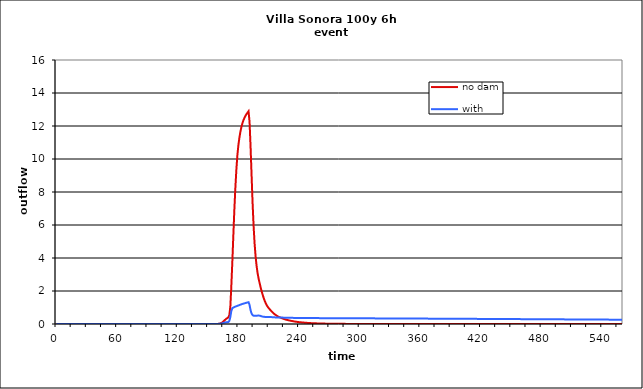
| Category | no dam | with dam |
|---|---|---|
| 0.0 | 0 | 0 |
| 1.0 | 0 | 0 |
| 2.0 | 0 | 0 |
| 3.0 | 0 | 0 |
| 4.0 | 0 | 0 |
| 5.0 | 0 | 0 |
| 6.0 | 0 | 0 |
| 7.0 | 0 | 0 |
| 8.0 | 0 | 0 |
| 9.0 | 0 | 0 |
| 10.0 | 0 | 0 |
| 11.0 | 0 | 0 |
| 12.0 | 0 | 0 |
| 13.0 | 0 | 0 |
| 14.0 | 0 | 0 |
| 15.0 | 0 | 0 |
| 16.0 | 0 | 0 |
| 17.0 | 0 | 0 |
| 18.0 | 0 | 0 |
| 19.0 | 0 | 0 |
| 20.0 | 0 | 0 |
| 21.0 | 0 | 0 |
| 22.0 | 0 | 0 |
| 23.0 | 0 | 0 |
| 24.0 | 0 | 0 |
| 25.0 | 0 | 0 |
| 26.0 | 0 | 0 |
| 27.0 | 0 | 0 |
| 28.0 | 0 | 0 |
| 29.0 | 0 | 0 |
| 30.0 | 0 | 0 |
| 31.0 | 0 | 0 |
| 32.0 | 0 | 0 |
| 33.0 | 0 | 0 |
| 34.0 | 0 | 0 |
| 35.0 | 0 | 0 |
| 36.0 | 0 | 0 |
| 37.0 | 0 | 0 |
| 38.0 | 0 | 0 |
| 39.0 | 0 | 0 |
| 40.0 | 0 | 0 |
| 41.0 | 0 | 0 |
| 42.0 | 0 | 0 |
| 43.0 | 0 | 0 |
| 44.0 | 0 | 0 |
| 45.0 | 0 | 0 |
| 46.0 | 0 | 0 |
| 47.0 | 0 | 0 |
| 48.0 | 0 | 0 |
| 49.0 | 0 | 0 |
| 50.0 | 0 | 0 |
| 51.0 | 0 | 0 |
| 52.0 | 0 | 0 |
| 53.0 | 0 | 0 |
| 54.0 | 0 | 0 |
| 55.0 | 0 | 0 |
| 56.0 | 0 | 0 |
| 57.0 | 0 | 0 |
| 58.0 | 0 | 0 |
| 59.0 | 0 | 0 |
| 60.0 | 0 | 0 |
| 61.0 | 0 | 0 |
| 62.0 | 0 | 0 |
| 63.0 | 0 | 0 |
| 64.0 | 0 | 0 |
| 65.0 | 0 | 0 |
| 66.0 | 0 | 0 |
| 67.0 | 0 | 0 |
| 68.0 | 0 | 0 |
| 69.0 | 0 | 0 |
| 70.0 | 0 | 0 |
| 71.0 | 0 | 0 |
| 72.0 | 0 | 0 |
| 73.0 | 0 | 0 |
| 74.0 | 0 | 0 |
| 75.0 | 0 | 0 |
| 76.0 | 0 | 0 |
| 77.0 | 0 | 0 |
| 78.0 | 0 | 0 |
| 79.0 | 0 | 0 |
| 80.0 | 0 | 0 |
| 81.0 | 0 | 0 |
| 82.0 | 0 | 0 |
| 83.0 | 0 | 0 |
| 84.0 | 0 | 0 |
| 85.0 | 0 | 0 |
| 86.0 | 0 | 0 |
| 87.0 | 0 | 0 |
| 88.0 | 0 | 0 |
| 89.0 | 0 | 0 |
| 90.0 | 0 | 0 |
| 91.0 | 0 | 0 |
| 92.0 | 0 | 0 |
| 93.0 | 0 | 0 |
| 94.0 | 0 | 0 |
| 95.0 | 0 | 0 |
| 96.0 | 0 | 0 |
| 97.0 | 0 | 0 |
| 98.0 | 0 | 0 |
| 99.0 | 0 | 0 |
| 100.0 | 0 | 0 |
| 101.0 | 0 | 0 |
| 102.0 | 0 | 0 |
| 103.0 | 0 | 0 |
| 104.0 | 0 | 0 |
| 105.0 | 0 | 0 |
| 106.0 | 0 | 0 |
| 107.0 | 0 | 0 |
| 108.0 | 0 | 0 |
| 109.0 | 0 | 0 |
| 110.0 | 0 | 0 |
| 111.0 | 0 | 0 |
| 112.0 | 0 | 0 |
| 113.0 | 0 | 0 |
| 114.0 | 0 | 0 |
| 115.0 | 0 | 0 |
| 116.0 | 0 | 0 |
| 117.0 | 0 | 0 |
| 118.0 | 0 | 0 |
| 119.0 | 0 | 0 |
| 120.0 | 0 | 0 |
| 121.0 | 0 | 0 |
| 122.0 | 0 | 0 |
| 123.0 | 0 | 0 |
| 124.0 | 0 | 0 |
| 125.0 | 0 | 0 |
| 126.0 | 0 | 0 |
| 127.0 | 0 | 0 |
| 128.0 | 0 | 0 |
| 129.0 | 0 | 0 |
| 130.0 | 0 | 0 |
| 131.0 | 0 | 0 |
| 132.0 | 0 | 0 |
| 133.0 | 0 | 0 |
| 134.0 | 0 | 0 |
| 135.0 | 0 | 0 |
| 136.0 | 0 | 0 |
| 137.0 | 0 | 0 |
| 138.0 | 0 | 0 |
| 139.0 | 0 | 0 |
| 140.0 | 0 | 0 |
| 141.0 | 0 | 0 |
| 142.0 | 0 | 0 |
| 143.0 | 0 | 0 |
| 144.0 | 0 | 0 |
| 145.0 | 0 | 0 |
| 146.0 | 0 | 0 |
| 147.0 | 0 | 0 |
| 148.0 | 0 | 0 |
| 149.0 | 0 | 0 |
| 150.0 | 0 | 0 |
| 151.0 | 0 | 0 |
| 152.0 | 0 | 0 |
| 153.0 | 0 | 0 |
| 154.0 | 0 | 0 |
| 155.0 | 0.001 | 0.001 |
| 156.0 | 0.001 | 0.001 |
| 157.0 | 0.002 | 0.002 |
| 158.0 | 0.003 | 0.003 |
| 159.0 | 0.004 | 0.005 |
| 160.0 | 0.008 | 0.007 |
| 161.0 | 0.01 | 0.01 |
| 162.0 | 0.037 | 0.017 |
| 163.0 | 0.063 | 0.027 |
| 164.0 | 0.095 | 0.042 |
| 165.0 | 0.143 | 0.06 |
| 166.0 | 0.206 | 0.079 |
| 167.0 | 0.265 | 0.094 |
| 168.0 | 0.317 | 0.105 |
| 169.0 | 0.36 | 0.112 |
| 170.0 | 0.398 | 0.117 |
| 171.0 | 0.539 | 0.186 |
| 172.0 | 1.054 | 0.429 |
| 173.0 | 2.341 | 0.794 |
| 174.0 | 3.813 | 0.962 |
| 175.0 | 5.418 | 0.999 |
| 176.0 | 6.974 | 1.025 |
| 177.0 | 8.288 | 1.054 |
| 178.0 | 9.398 | 1.078 |
| 179.0 | 10.257 | 1.101 |
| 180.0 | 10.858 | 1.125 |
| 181.0 | 11.307 | 1.148 |
| 182.0 | 11.668 | 1.172 |
| 183.0 | 11.954 | 1.194 |
| 184.0 | 12.178 | 1.215 |
| 185.0 | 12.358 | 1.235 |
| 186.0 | 12.499 | 1.254 |
| 187.0 | 12.62 | 1.272 |
| 188.0 | 12.723 | 1.289 |
| 189.0 | 12.81 | 1.305 |
| 190.0 | 12.893 | 1.32 |
| 191.0 | 12.262 | 1.159 |
| 192.0 | 10.764 | 0.843 |
| 193.0 | 9.039 | 0.634 |
| 194.0 | 7.346 | 0.539 |
| 195.0 | 5.944 | 0.504 |
| 196.0 | 4.874 | 0.498 |
| 197.0 | 4.085 | 0.501 |
| 198.0 | 3.505 | 0.505 |
| 199.0 | 3.068 | 0.508 |
| 200.0 | 2.741 | 0.511 |
| 201.0 | 2.471 | 0.505 |
| 202.0 | 2.213 | 0.486 |
| 203.0 | 1.977 | 0.463 |
| 204.0 | 1.766 | 0.448 |
| 205.0 | 1.575 | 0.437 |
| 206.0 | 1.406 | 0.431 |
| 207.0 | 1.26 | 0.429 |
| 208.0 | 1.139 | 0.429 |
| 209.0 | 1.04 | 0.43 |
| 210.0 | 0.959 | 0.431 |
| 211.0 | 0.888 | 0.429 |
| 212.0 | 0.82 | 0.424 |
| 213.0 | 0.754 | 0.416 |
| 214.0 | 0.692 | 0.41 |
| 215.0 | 0.635 | 0.405 |
| 216.0 | 0.584 | 0.402 |
| 217.0 | 0.538 | 0.399 |
| 218.0 | 0.498 | 0.398 |
| 219.0 | 0.462 | 0.397 |
| 220.0 | 0.431 | 0.398 |
| 221.0 | 0.403 | 0.397 |
| 222.0 | 0.378 | 0.394 |
| 223.0 | 0.353 | 0.39 |
| 224.0 | 0.328 | 0.387 |
| 225.0 | 0.306 | 0.385 |
| 226.0 | 0.285 | 0.383 |
| 227.0 | 0.266 | 0.381 |
| 228.0 | 0.249 | 0.38 |
| 229.0 | 0.233 | 0.379 |
| 230.0 | 0.219 | 0.378 |
| 231.0 | 0.205 | 0.377 |
| 232.0 | 0.193 | 0.375 |
| 233.0 | 0.181 | 0.373 |
| 234.0 | 0.169 | 0.372 |
| 235.0 | 0.158 | 0.37 |
| 236.0 | 0.147 | 0.369 |
| 237.0 | 0.138 | 0.368 |
| 238.0 | 0.129 | 0.367 |
| 239.0 | 0.121 | 0.366 |
| 240.0 | 0.113 | 0.365 |
| 241.0 | 0.107 | 0.365 |
| 242.0 | 0.1 | 0.364 |
| 243.0 | 0.094 | 0.363 |
| 244.0 | 0.089 | 0.362 |
| 245.0 | 0.083 | 0.362 |
| 246.0 | 0.078 | 0.361 |
| 247.0 | 0.073 | 0.36 |
| 248.0 | 0.068 | 0.36 |
| 249.0 | 0.064 | 0.36 |
| 250.0 | 0.06 | 0.359 |
| 251.0 | 0.056 | 0.359 |
| 252.0 | 0.052 | 0.358 |
| 253.0 | 0.049 | 0.358 |
| 254.0 | 0.046 | 0.357 |
| 255.0 | 0.044 | 0.357 |
| 256.0 | 0.041 | 0.357 |
| 257.0 | 0.039 | 0.357 |
| 258.0 | 0.036 | 0.356 |
| 259.0 | 0.034 | 0.356 |
| 260.0 | 0.032 | 0.356 |
| 261.0 | 0.03 | 0.356 |
| 262.0 | 0.029 | 0.355 |
| 263.0 | 0.027 | 0.355 |
| 264.0 | 0.025 | 0.355 |
| 265.0 | 0.024 | 0.355 |
| 266.0 | 0.023 | 0.354 |
| 267.0 | 0.021 | 0.354 |
| 268.0 | 0.02 | 0.354 |
| 269.0 | 0.019 | 0.354 |
| 270.0 | 0.018 | 0.353 |
| 271.0 | 0.017 | 0.353 |
| 272.0 | 0.016 | 0.353 |
| 273.0 | 0.015 | 0.353 |
| 274.0 | 0.014 | 0.352 |
| 275.0 | 0.014 | 0.352 |
| 276.0 | 0.013 | 0.352 |
| 277.0 | 0.012 | 0.352 |
| 278.0 | 0.011 | 0.351 |
| 279.0 | 0.011 | 0.351 |
| 280.0 | 0.01 | 0.351 |
| 281.0 | 0.01 | 0.35 |
| 282.0 | 0.009 | 0.35 |
| 283.0 | 0.009 | 0.35 |
| 284.0 | 0.008 | 0.35 |
| 285.0 | 0.008 | 0.349 |
| 286.0 | 0.007 | 0.349 |
| 287.0 | 0.007 | 0.349 |
| 288.0 | 0.007 | 0.349 |
| 289.0 | 0.006 | 0.348 |
| 290.0 | 0.006 | 0.348 |
| 291.0 | 0.005 | 0.348 |
| 292.0 | 0.005 | 0.347 |
| 293.0 | 0.005 | 0.347 |
| 294.0 | 0.005 | 0.347 |
| 295.0 | 0.004 | 0.347 |
| 296.0 | 0.004 | 0.346 |
| 297.0 | 0.004 | 0.346 |
| 298.0 | 0.003 | 0.346 |
| 299.0 | 0.003 | 0.345 |
| 300.0 | 0.003 | 0.345 |
| 301.0 | 0.003 | 0.345 |
| 302.0 | 0.003 | 0.345 |
| 303.0 | 0.002 | 0.344 |
| 304.0 | 0.002 | 0.344 |
| 305.0 | 0.002 | 0.344 |
| 306.0 | 0.002 | 0.343 |
| 307.0 | 0.002 | 0.343 |
| 308.0 | 0.002 | 0.343 |
| 309.0 | 0.001 | 0.343 |
| 310.0 | 0.001 | 0.342 |
| 311.0 | 0.001 | 0.342 |
| 312.0 | 0.001 | 0.342 |
| 313.0 | 0.001 | 0.341 |
| 314.0 | 0.001 | 0.341 |
| 315.0 | 0.001 | 0.341 |
| 316.0 | 0.001 | 0.341 |
| 317.0 | 0.001 | 0.34 |
| 318.0 | 0.001 | 0.34 |
| 319.0 | 0.001 | 0.34 |
| 320.0 | 0 | 0.339 |
| 321.0 | 0 | 0.339 |
| 322.0 | 0 | 0.339 |
| 323.0 | 0 | 0.339 |
| 324.0 | 0 | 0.338 |
| 325.0 | 0 | 0.338 |
| 326.0 | 0 | 0.338 |
| 327.0 | 0 | 0.337 |
| 328.0 | 0 | 0.337 |
| 329.0 | 0 | 0.337 |
| 330.0 | 0 | 0.337 |
| 331.0 | 0 | 0.336 |
| 332.0 | 0 | 0.336 |
| 333.0 | 0 | 0.336 |
| 334.0 | 0 | 0.335 |
| 335.0 | 0 | 0.335 |
| 336.0 | 0 | 0.335 |
| 337.0 | 0 | 0.335 |
| 338.0 | 0 | 0.334 |
| 339.0 | 0 | 0.334 |
| 340.0 | 0 | 0.334 |
| 341.0 | 0 | 0.333 |
| 342.0 | 0 | 0.333 |
| 343.0 | 0 | 0.333 |
| 344.0 | 0 | 0.332 |
| 345.0 | 0 | 0.332 |
| 346.0 | 0 | 0.332 |
| 347.0 | 0 | 0.332 |
| 348.0 | 0 | 0.331 |
| 349.0 | 0 | 0.331 |
| 350.0 | 0 | 0.331 |
| 351.0 | 0 | 0.33 |
| 352.0 | 0 | 0.33 |
| 353.0 | 0 | 0.33 |
| 354.0 | 0 | 0.33 |
| 355.0 | 0 | 0.329 |
| 356.0 | 0 | 0.329 |
| 357.0 | 0 | 0.329 |
| 358.0 | 0 | 0.328 |
| 359.0 | 0 | 0.328 |
| 360.0 | 0 | 0.328 |
| 361.0 | 0 | 0.328 |
| 362.0 | 0 | 0.327 |
| 363.0 | 0 | 0.327 |
| 364.0 | 0 | 0.327 |
| 365.0 | 0 | 0.326 |
| 366.0 | 0 | 0.326 |
| 367.0 | 0 | 0.326 |
| 368.0 | 0 | 0.325 |
| 369.0 | 0 | 0.325 |
| 370.0 | 0 | 0.325 |
| 371.0 | 0 | 0.325 |
| 372.0 | 0 | 0.324 |
| 373.0 | 0 | 0.324 |
| 374.0 | 0 | 0.324 |
| 375.0 | 0 | 0.323 |
| 376.0 | 0 | 0.323 |
| 377.0 | 0 | 0.323 |
| 378.0 | 0 | 0.323 |
| 379.0 | 0 | 0.322 |
| 380.0 | 0 | 0.322 |
| 381.0 | 0 | 0.322 |
| 382.0 | 0 | 0.321 |
| 383.0 | 0 | 0.321 |
| 384.0 | 0 | 0.321 |
| 385.0 | 0 | 0.32 |
| 386.0 | 0 | 0.32 |
| 387.0 | 0 | 0.32 |
| 388.0 | 0 | 0.32 |
| 389.0 | 0 | 0.319 |
| 390.0 | 0 | 0.319 |
| 391.0 | 0 | 0.319 |
| 392.0 | 0 | 0.318 |
| 393.0 | 0 | 0.318 |
| 394.0 | 0 | 0.318 |
| 395.0 | 0 | 0.318 |
| 396.0 | 0 | 0.317 |
| 397.0 | 0 | 0.317 |
| 398.0 | 0 | 0.317 |
| 399.0 | 0 | 0.316 |
| 400.0 | 0 | 0.316 |
| 401.0 | 0 | 0.316 |
| 402.0 | 0 | 0.315 |
| 403.0 | 0 | 0.315 |
| 404.0 | 0 | 0.315 |
| 405.0 | 0 | 0.314 |
| 406.0 | 0 | 0.314 |
| 407.0 | 0 | 0.314 |
| 408.0 | 0 | 0.313 |
| 409.0 | 0 | 0.313 |
| 410.0 | 0 | 0.313 |
| 411.0 | 0 | 0.312 |
| 412.0 | 0 | 0.312 |
| 413.0 | 0 | 0.312 |
| 414.0 | 0 | 0.311 |
| 415.0 | 0 | 0.311 |
| 416.0 | 0 | 0.31 |
| 417.0 | 0 | 0.31 |
| 418.0 | 0 | 0.31 |
| 419.0 | 0 | 0.309 |
| 420.0 | 0 | 0.309 |
| 421.0 | 0 | 0.309 |
| 422.0 | 0 | 0.308 |
| 423.0 | 0 | 0.308 |
| 424.0 | 0 | 0.308 |
| 425.0 | 0 | 0.307 |
| 426.0 | 0 | 0.307 |
| 427.0 | 0 | 0.307 |
| 428.0 | 0 | 0.306 |
| 429.0 | 0 | 0.306 |
| 430.0 | 0 | 0.306 |
| 431.0 | 0 | 0.305 |
| 432.0 | 0 | 0.305 |
| 433.0 | 0 | 0.304 |
| 434.0 | 0 | 0.304 |
| 435.0 | 0 | 0.304 |
| 436.0 | 0 | 0.303 |
| 437.0 | 0 | 0.303 |
| 438.0 | 0 | 0.303 |
| 439.0 | 0 | 0.302 |
| 440.0 | 0 | 0.302 |
| 441.0 | 0 | 0.302 |
| 442.0 | 0 | 0.301 |
| 443.0 | 0 | 0.301 |
| 444.0 | 0 | 0.301 |
| 445.0 | 0 | 0.3 |
| 446.0 | 0 | 0.3 |
| 447.0 | 0 | 0.3 |
| 448.0 | 0 | 0.299 |
| 449.0 | 0 | 0.299 |
| 450.0 | 0 | 0.298 |
| 451.0 | 0 | 0.298 |
| 452.0 | 0 | 0.298 |
| 453.0 | 0 | 0.297 |
| 454.0 | 0 | 0.297 |
| 455.0 | 0 | 0.297 |
| 456.0 | 0 | 0.296 |
| 457.0 | 0 | 0.296 |
| 458.0 | 0 | 0.296 |
| 459.0 | 0 | 0.295 |
| 460.0 | 0 | 0.295 |
| 461.0 | 0 | 0.295 |
| 462.0 | 0 | 0.294 |
| 463.0 | 0 | 0.294 |
| 464.0 | 0 | 0.294 |
| 465.0 | 0 | 0.293 |
| 466.0 | 0 | 0.293 |
| 467.0 | 0 | 0.293 |
| 468.0 | 0 | 0.292 |
| 469.0 | 0 | 0.292 |
| 470.0 | 0 | 0.292 |
| 471.0 | 0 | 0.291 |
| 472.0 | 0 | 0.291 |
| 473.0 | 0 | 0.29 |
| 474.0 | 0 | 0.29 |
| 475.0 | 0 | 0.29 |
| 476.0 | 0 | 0.289 |
| 477.0 | 0 | 0.289 |
| 478.0 | 0 | 0.289 |
| 479.0 | 0 | 0.288 |
| 480.0 | 0 | 0.288 |
| 481.0 | 0 | 0.288 |
| 482.0 | 0 | 0.287 |
| 483.0 | 0 | 0.287 |
| 484.0 | 0 | 0.287 |
| 485.0 | 0 | 0.286 |
| 486.0 | 0 | 0.286 |
| 487.0 | 0 | 0.286 |
| 488.0 | 0 | 0.285 |
| 489.0 | 0 | 0.285 |
| 490.0 | 0 | 0.285 |
| 491.0 | 0 | 0.284 |
| 492.0 | 0 | 0.284 |
| 493.0 | 0 | 0.284 |
| 494.0 | 0 | 0.283 |
| 495.0 | 0 | 0.283 |
| 496.0 | 0 | 0.282 |
| 497.0 | 0 | 0.282 |
| 498.0 | 0 | 0.282 |
| 499.0 | 0 | 0.281 |
| 500.0 | 0 | 0.281 |
| 501.0 | 0 | 0.281 |
| 502.0 | 0 | 0.28 |
| 503.0 | 0 | 0.28 |
| 504.0 | 0 | 0.28 |
| 505.0 | 0 | 0.279 |
| 506.0 | 0 | 0.279 |
| 507.0 | 0 | 0.279 |
| 508.0 | 0 | 0.278 |
| 509.0 | 0 | 0.278 |
| 510.0 | 0 | 0.278 |
| 511.0 | 0 | 0.277 |
| 512.0 | 0 | 0.277 |
| 513.0 | 0 | 0.277 |
| 514.0 | 0 | 0.276 |
| 515.0 | 0 | 0.276 |
| 516.0 | 0 | 0.276 |
| 517.0 | 0 | 0.275 |
| 518.0 | 0 | 0.275 |
| 519.0 | 0 | 0.275 |
| 520.0 | 0 | 0.274 |
| 521.0 | 0 | 0.274 |
| 522.0 | 0 | 0.273 |
| 523.0 | 0 | 0.273 |
| 524.0 | 0 | 0.273 |
| 525.0 | 0 | 0.272 |
| 526.0 | 0 | 0.272 |
| 527.0 | 0 | 0.272 |
| 528.0 | 0 | 0.271 |
| 529.0 | 0 | 0.271 |
| 530.0 | 0 | 0.271 |
| 531.0 | 0 | 0.27 |
| 532.0 | 0 | 0.27 |
| 533.0 | 0 | 0.27 |
| 534.0 | 0 | 0.269 |
| 535.0 | 0 | 0.269 |
| 536.0 | 0 | 0.269 |
| 537.0 | 0 | 0.268 |
| 538.0 | 0 | 0.268 |
| 539.0 | 0 | 0.268 |
| 540.0 | 0 | 0.267 |
| 541.0 | 0 | 0.267 |
| 542.0 | 0 | 0.267 |
| 543.0 | 0 | 0.266 |
| 544.0 | 0 | 0.266 |
| 545.0 | 0 | 0.266 |
| 546.0 | 0 | 0.265 |
| 547.0 | 0 | 0.265 |
| 548.0 | 0 | 0.265 |
| 549.0 | 0 | 0.264 |
| 550.0 | 0 | 0.264 |
| 551.0 | 0 | 0.264 |
| 552.0 | 0 | 0.263 |
| 553.0 | 0 | 0.263 |
| 554.0 | 0 | 0.263 |
| 555.0 | 0 | 0.262 |
| 556.0 | 0 | 0.262 |
| 557.0 | 0 | 0.261 |
| 558.0 | 0 | 0.261 |
| 559.0 | 0 | 0.261 |
| 560.0 | 0 | 0.26 |